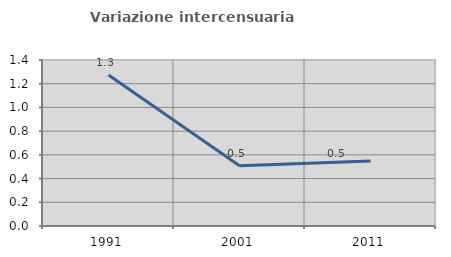
| Category | Variazione intercensuaria annua |
|---|---|
| 1991.0 | 1.274 |
| 2001.0 | 0.507 |
| 2011.0 | 0.548 |